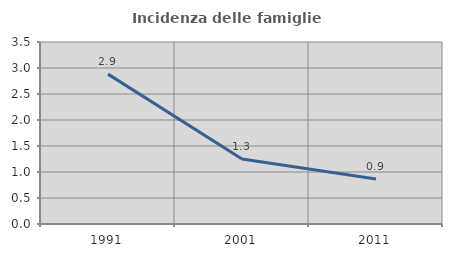
| Category | Incidenza delle famiglie numerose |
|---|---|
| 1991.0 | 2.882 |
| 2001.0 | 1.251 |
| 2011.0 | 0.864 |